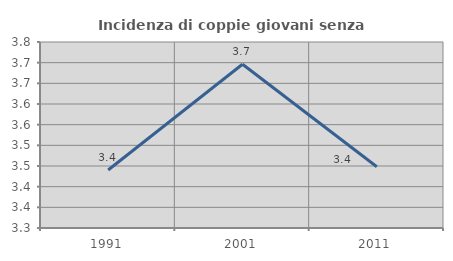
| Category | Incidenza di coppie giovani senza figli |
|---|---|
| 1991.0 | 3.44 |
| 2001.0 | 3.696 |
| 2011.0 | 3.448 |